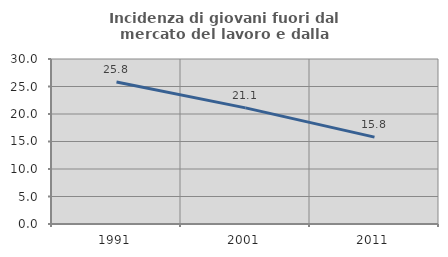
| Category | Incidenza di giovani fuori dal mercato del lavoro e dalla formazione  |
|---|---|
| 1991.0 | 25.815 |
| 2001.0 | 21.109 |
| 2011.0 | 15.799 |